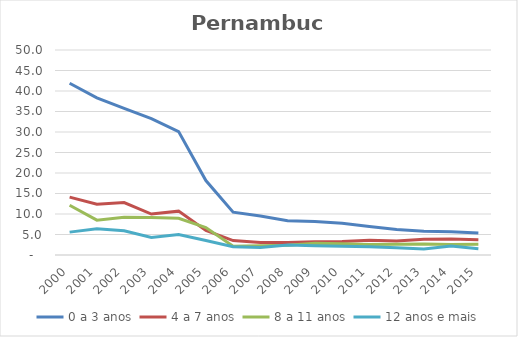
| Category | 0 a 3 anos | 4 a 7 anos | 8 a 11 anos | 12 anos e mais |
|---|---|---|---|---|
| 2000.0 | 41.892 | 14.126 | 12.139 | 5.58 |
| 2001.0 | 38.32 | 12.397 | 8.503 | 6.374 |
| 2002.0 | 35.749 | 12.805 | 9.221 | 5.894 |
| 2003.0 | 33.283 | 9.978 | 9.13 | 4.3 |
| 2004.0 | 30.109 | 10.696 | 8.938 | 4.996 |
| 2005.0 | 18.155 | 5.984 | 6.684 | 3.556 |
| 2006.0 | 10.445 | 3.513 | 2.158 | 2.039 |
| 2007.0 | 9.489 | 3.045 | 2.28 | 1.856 |
| 2008.0 | 8.342 | 3.035 | 2.379 | 2.429 |
| 2009.0 | 8.171 | 3.22 | 2.866 | 2.237 |
| 2010.0 | 7.743 | 3.305 | 2.725 | 2.143 |
| 2011.0 | 6.938 | 3.585 | 2.542 | 2.03 |
| 2012.0 | 6.225 | 3.424 | 2.636 | 1.754 |
| 2013.0 | 5.792 | 3.823 | 2.673 | 1.454 |
| 2014.0 | 5.663 | 3.907 | 2.555 | 2.21 |
| 2015.0 | 5.365 | 3.711 | 2.639 | 1.55 |